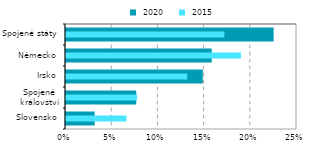
| Category |  2020 |
|---|---|
| Slovensko | 0.031 |
| Spojené
království | 0.076 |
| Irsko | 0.148 |
| Německo | 0.158 |
| Spojené státy | 0.225 |